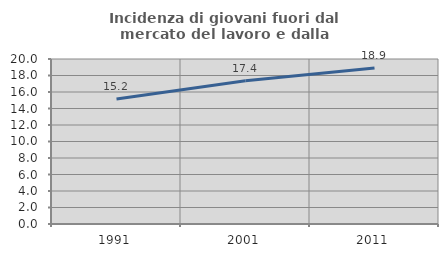
| Category | Incidenza di giovani fuori dal mercato del lavoro e dalla formazione  |
|---|---|
| 1991.0 | 15.16 |
| 2001.0 | 17.353 |
| 2011.0 | 18.919 |